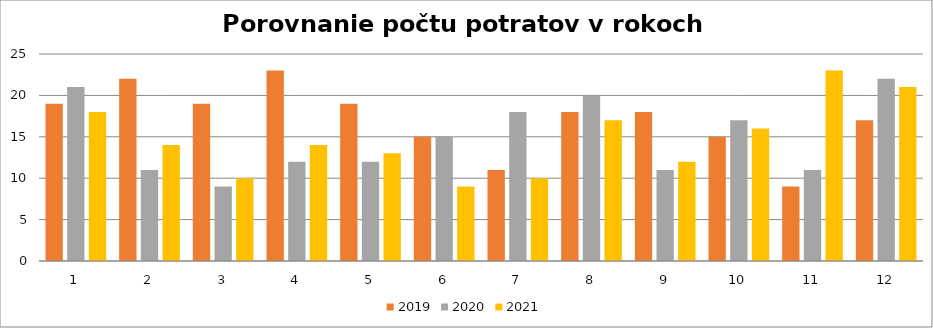
| Category | 2019 | 2020 | 2021 |
|---|---|---|---|
| 0 | 19 | 21 | 18 |
| 1 | 22 | 11 | 14 |
| 2 | 19 | 9 | 10 |
| 3 | 23 | 12 | 14 |
| 4 | 19 | 12 | 13 |
| 5 | 15 | 15 | 9 |
| 6 | 11 | 18 | 10 |
| 7 | 18 | 20 | 17 |
| 8 | 18 | 11 | 12 |
| 9 | 15 | 17 | 16 |
| 10 | 9 | 11 | 23 |
| 11 | 17 | 22 | 21 |